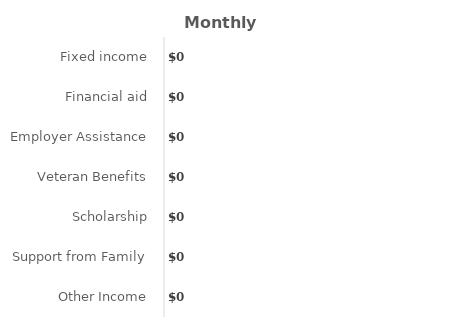
| Category | Per Month |
|---|---|
| Fixed income | 0 |
| Financial aid | 0 |
| Employer Assistance | 0 |
| Veteran Benefits | 0 |
| Scholarship | 0 |
| Support from Family | 0 |
| Other Income | 0 |